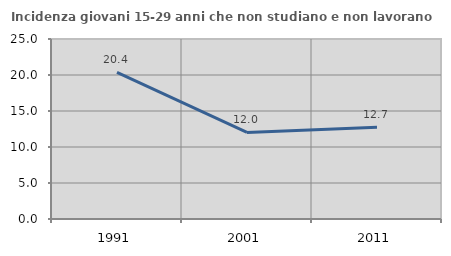
| Category | Incidenza giovani 15-29 anni che non studiano e non lavorano  |
|---|---|
| 1991.0 | 20.359 |
| 2001.0 | 12.026 |
| 2011.0 | 12.738 |